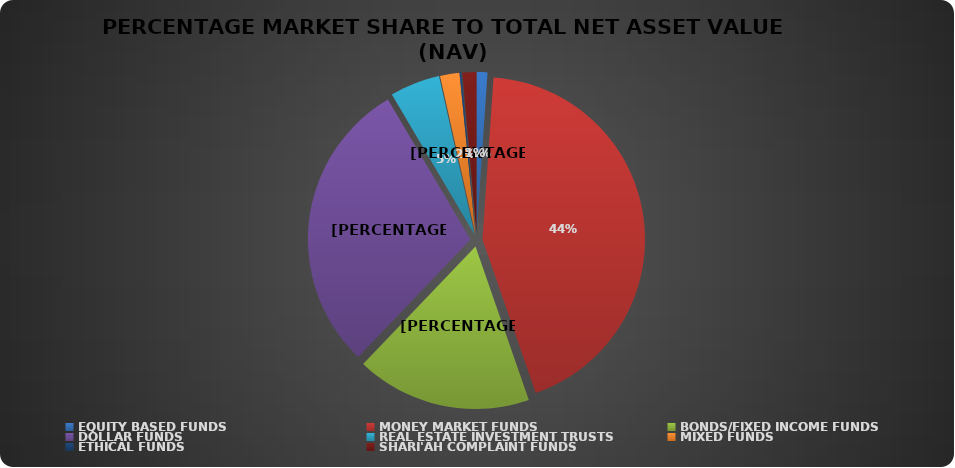
| Category | NET ASSET VALUE |
|---|---|
| EQUITY BASED FUNDS | 20288689104.51 |
| MONEY MARKET FUNDS | 817523630430.576 |
| BONDS/FIXED INCOME FUNDS | 327549421729.357 |
| DOLLAR FUNDS | 550519578291.039 |
| REAL ESTATE INVESTMENT TRUSTS | 93463222418.47 |
| MIXED FUNDS | 36228102075.464 |
| ETHICAL FUNDS | 3378418489.83 |
| SHARI'AH COMPLAINT FUNDS | 26082310834.12 |